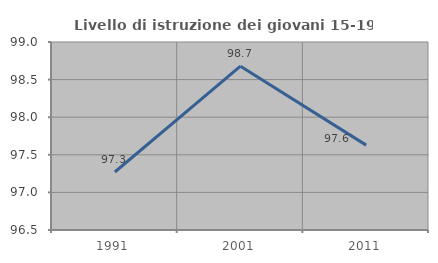
| Category | Livello di istruzione dei giovani 15-19 anni |
|---|---|
| 1991.0 | 97.271 |
| 2001.0 | 98.678 |
| 2011.0 | 97.629 |